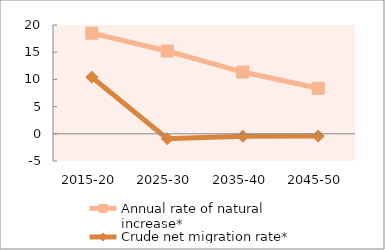
| Category | Annual rate of natural increase* | Crude net migration rate* |
|---|---|---|
| 2015-20 | 18.505 | 10.417 |
| 2025-30 | 15.217 | -0.899 |
| 2035-40 | 11.351 | -0.446 |
| 2045-50 | 8.363 | -0.406 |